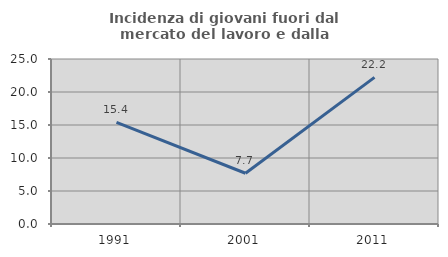
| Category | Incidenza di giovani fuori dal mercato del lavoro e dalla formazione  |
|---|---|
| 1991.0 | 15.385 |
| 2001.0 | 7.692 |
| 2011.0 | 22.222 |